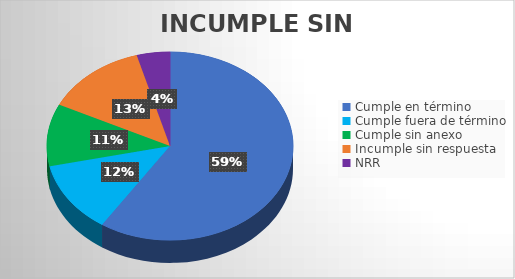
| Category | TOTAL |
|---|---|
| Cumple en término | 150 |
| Cumple fuera de término | 31 |
| Cumple sin anexo | 27 |
| Incumple sin respuesta | 34 |
| NRR | 11 |